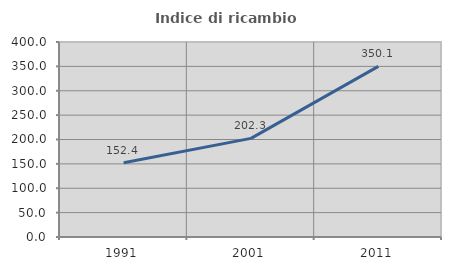
| Category | Indice di ricambio occupazionale  |
|---|---|
| 1991.0 | 152.374 |
| 2001.0 | 202.308 |
| 2011.0 | 350.096 |